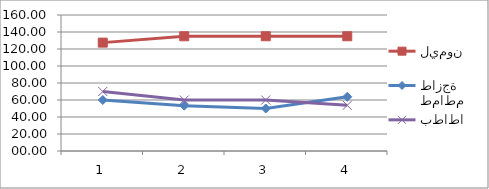
| Category | ليمون | طماطم طازجة | بطاطا |
|---|---|---|---|
| 0 | 127.5 | 60 | 70 |
| 1 | 135 | 53.33 | 60 |
| 2 | 135 | 50 | 60 |
| 3 | 135 | 63.75 | 53.75 |